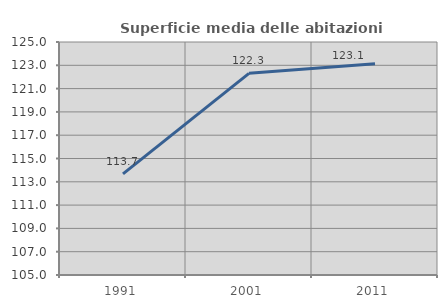
| Category | Superficie media delle abitazioni occupate |
|---|---|
| 1991.0 | 113.68 |
| 2001.0 | 122.312 |
| 2011.0 | 123.138 |